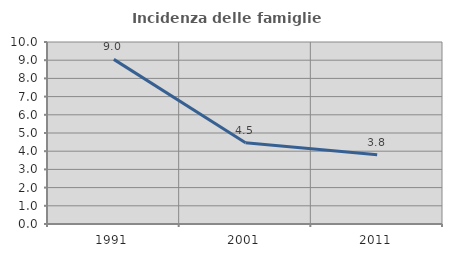
| Category | Incidenza delle famiglie numerose |
|---|---|
| 1991.0 | 9.045 |
| 2001.0 | 4.468 |
| 2011.0 | 3.805 |